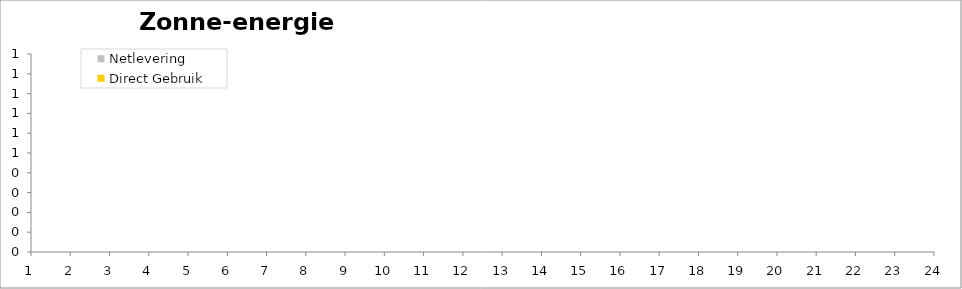
| Category | Direct Gebruik | Netlevering |
|---|---|---|
| 0 | 0 | 0 |
| 1900-01-01 | 0 | 0 |
| 1900-01-02 | 0 | 0 |
| 1900-01-03 | 0 | 0 |
| 1900-01-04 | 0 | 0 |
| 1900-01-05 | 0 | 0 |
| 1900-01-06 | 0 | 0 |
| 1900-01-07 | 0 | 0 |
| 1900-01-08 | 0 | 0 |
| 1900-01-09 | 0 | 0 |
| 1900-01-10 | 0 | 0 |
| 1900-01-11 | 0 | 0 |
| 1900-01-12 | 0 | 0 |
| 1900-01-13 | 0 | 0 |
| 1900-01-14 | 0 | 0 |
| 1900-01-15 | 0 | 0 |
| 1900-01-16 | 0 | 0 |
| 1900-01-17 | 0 | 0 |
| 1900-01-18 | 0 | 0 |
| 1900-01-19 | 0 | 0 |
| 1900-01-20 | 0 | 0 |
| 1900-01-21 | 0 | 0 |
| 1900-01-22 | 0 | 0 |
| 1900-01-23 | 0 | 0 |